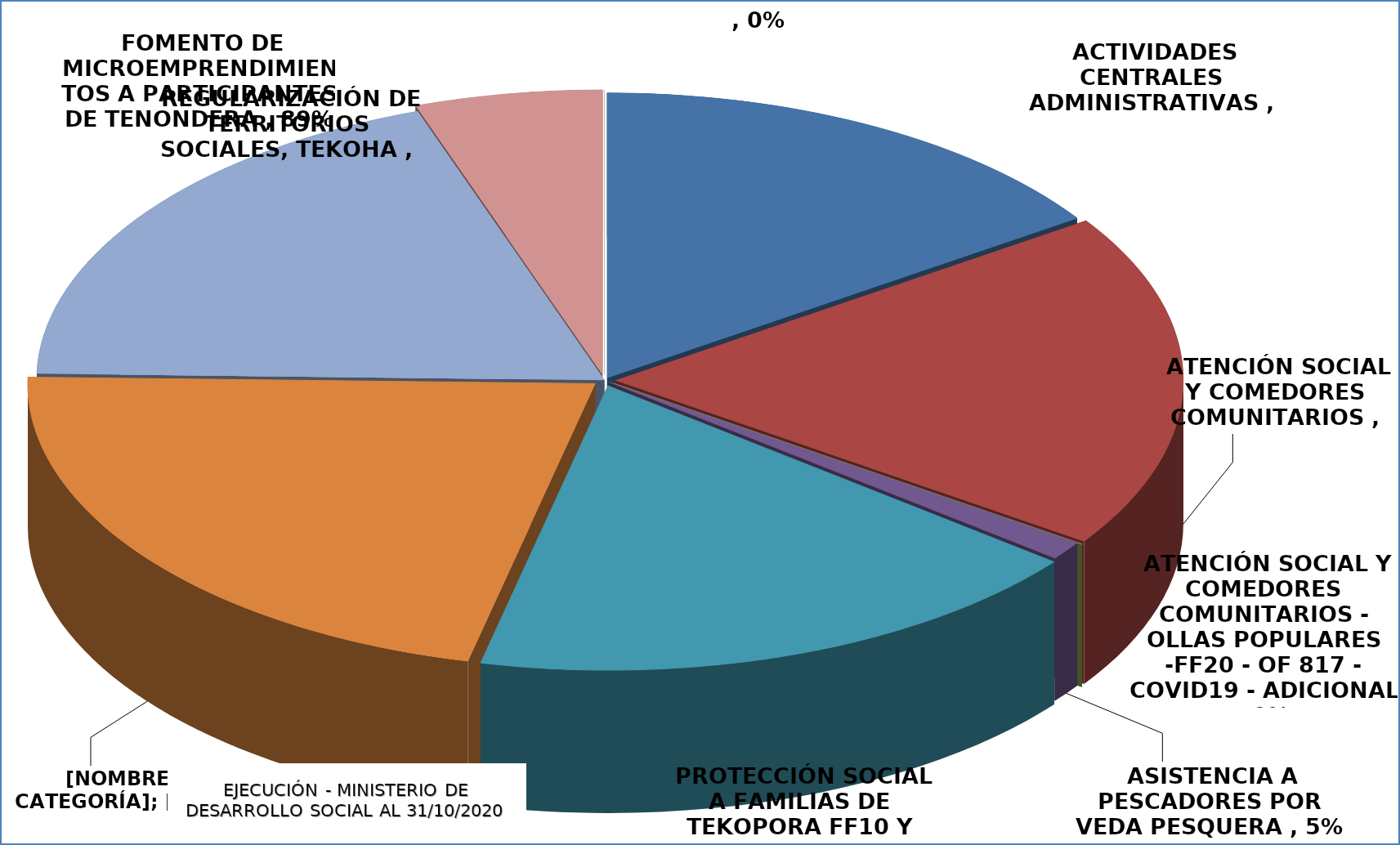
| Category | EJECUCIÓN - MINISTERIO DE DESARROLLO SOCIAL |
|---|---|
| ACTIVIDADES CENTRALES ADMINISTRATIVAS | 0.714 |
| ATENCIÓN SOCIAL Y COMEDORES COMUNITARIOS | 0.875 |
| ATENCIÓN SOCIAL Y COMEDORES COMUNITARIOS - OLLAS POPULARES -FF20 - OF 817 - COVID19 - ADICIONAL | 0 |
| ASISTENCIA A PESCADORES POR VEDA PESQUERA | 0.049 |
| PROTECCIÓN SOCIAL A FAMILIAS DE TEKOPORA FF10 Y FF20 | 0.827 |
| TRAN. MONETARIAS A FAMILIAS AFECTADAS POR COVID19- ADICIONAL | 1 |
| FOMENTO DE MICROEMPRENDIMIENTOS A PARTICIPANTES DE TENONDERA | 0.887 |
| REGULARIZACIÓN DE TERRITORIOS SOCIALES, TEKOHA | 0.245 |